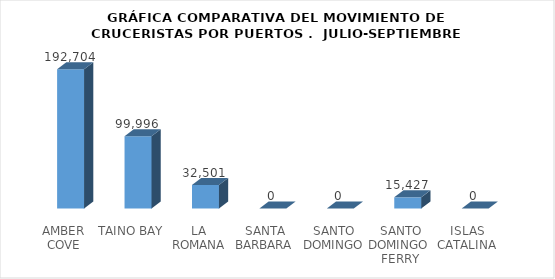
| Category | Series 0 |
|---|---|
| AMBER COVE | 192704 |
| TAINO BAY | 99996 |
| LA ROMANA | 32501 |
| SANTA BARBARA  | 0 |
| SANTO DOMINGO | 0 |
| SANTO DOMINGO  FERRY | 15427 |
| ISLAS  CATALINA  | 0 |